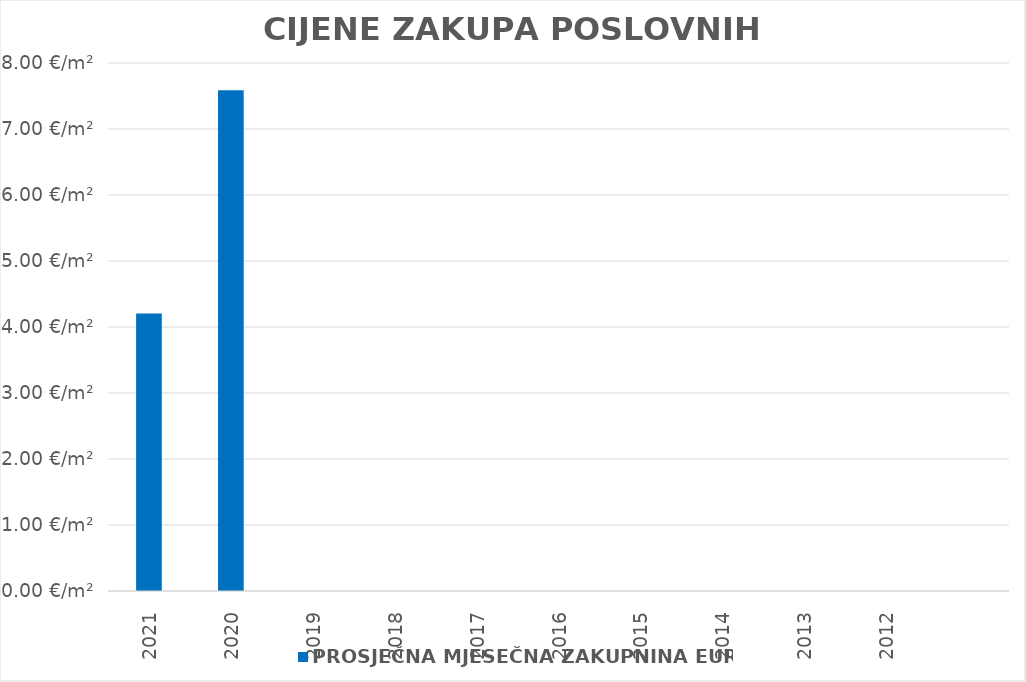
| Category | PROSJEČNA MJESEČNA ZAKUPNINA EUR/m2 |
|---|---|
| 2021 | 1900-01-04 04:52:40 |
| 2020 | 1900-01-07 14:07:25 |
| 2019 | 0 |
| 2018 | 0 |
| 2017 | 0 |
| 2016 | 0 |
| 2015 | 0 |
| 2014 | 0 |
| 2013 | 0 |
| 2012 | 0 |